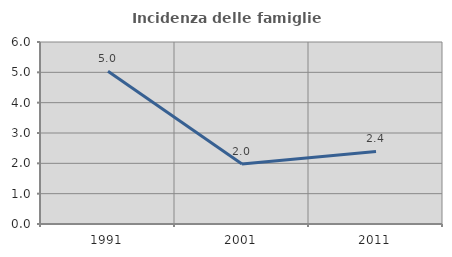
| Category | Incidenza delle famiglie numerose |
|---|---|
| 1991.0 | 5.037 |
| 2001.0 | 1.975 |
| 2011.0 | 2.394 |